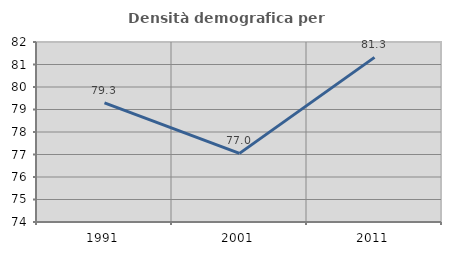
| Category | Densità demografica |
|---|---|
| 1991.0 | 79.295 |
| 2001.0 | 77.049 |
| 2011.0 | 81.317 |